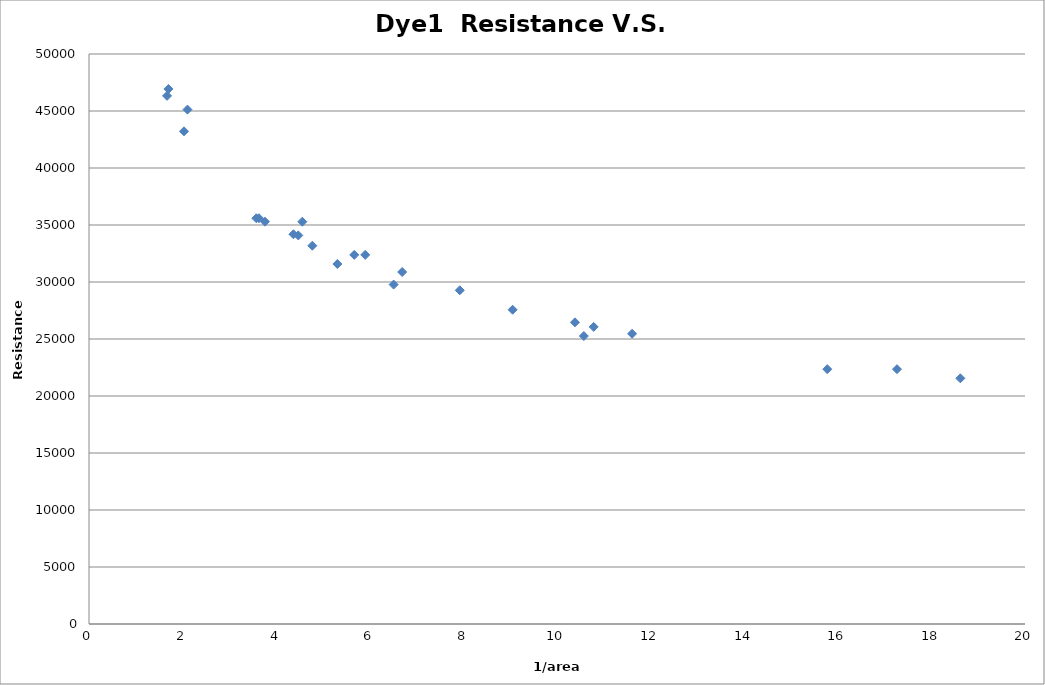
| Category | Series 0 |
|---|---|
| 1.6967999999999999 | 46930.928 |
| 2.0296 | 43217.304 |
| 1.6683999999999999 | 46328.68 |
| 2.1037 | 45124.23 |
| 4.772200000000001 | 33183.297 |
| 3.7600000000000002 | 35290.098 |
| 3.632 | 35591.084 |
| 3.5752 | 35591.084 |
| 6.5095 | 29772.67 |
| 4.558 | 35290.098 |
| 4.472 | 34086.189 |
| 4.368 | 34186.513 |
| 6.6926000000000005 | 30876.056 |
| 7.9222 | 29271.147 |
| 5.902 | 32380.754 |
| 5.668000000000001 | 32380.754 |
| 5.3072 | 31578.237 |
| 10.7835 | 26061.644 |
| 11.6046 | 25459.909 |
| 10.3834 | 26462.809 |
| 9.052 | 27566.046 |
| 10.573500000000001 | 25259.334 |
| 15.7752 | 22351.18 |
| 18.618599999999997 | 21548.991 |
| 17.264 | 22351.18 |